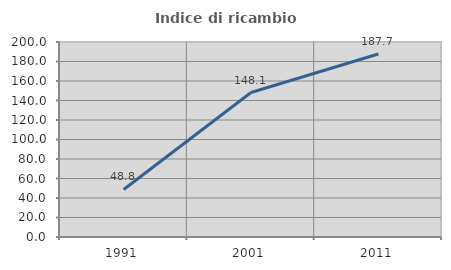
| Category | Indice di ricambio occupazionale  |
|---|---|
| 1991.0 | 48.78 |
| 2001.0 | 148.148 |
| 2011.0 | 187.719 |